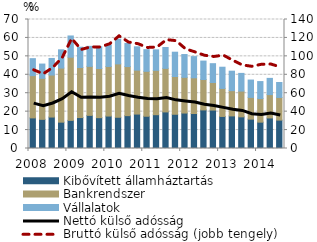
| Category | Kibővített államháztartás | Bankrendszer | Vállalatok |
|---|---|---|---|
| 2008.0 | 16.608 | 22.925 | 9.223 |
| 2008.0 | 15.82 | 22.255 | 7.745 |
| 2008.0 | 17.064 | 22.789 | 9.011 |
| 2008.0 | 14.293 | 29.355 | 9.899 |
| 2009.0 | 15.261 | 34.267 | 11.534 |
| 2009.0 | 16.791 | 27.156 | 11.018 |
| 2009.0 | 17.974 | 26.589 | 10.865 |
| 2009.0 | 16.729 | 26.675 | 11.791 |
| 2010.0 | 17.609 | 26.906 | 11.672 |
| 2010.0 | 16.954 | 28.953 | 13.399 |
| 2010.0 | 17.832 | 26.637 | 12.563 |
| 2010.0 | 18.679 | 23.843 | 12.659 |
| 2011.0 | 17.503 | 24.382 | 11.75 |
| 2011.0 | 18.344 | 24.075 | 11.11 |
| 2011.0 | 19.846 | 23.641 | 11.331 |
| 2011.0 | 18.573 | 20.501 | 13.184 |
| 2012.0 | 19.241 | 19.38 | 12.372 |
| 2012.0 | 18.989 | 19.381 | 11.489 |
| 2012.0 | 20.922 | 16.517 | 10.001 |
| 2012.0 | 20.839 | 14.964 | 10.225 |
| 2013.0 | 17.396 | 15.203 | 11.507 |
| 2013.0 | 17.688 | 13.709 | 10.561 |
| 2013.0 | 17.178 | 13.979 | 9.598 |
| 2013.0 | 15.933 | 11.807 | 9.4 |
| 2014.0 | 14.296 | 12.799 | 9.221 |
| 2014.0 | 16.578 | 12.668 | 8.807 |
| 2014.0 | 15.405 | 12.291 | 8.121 |